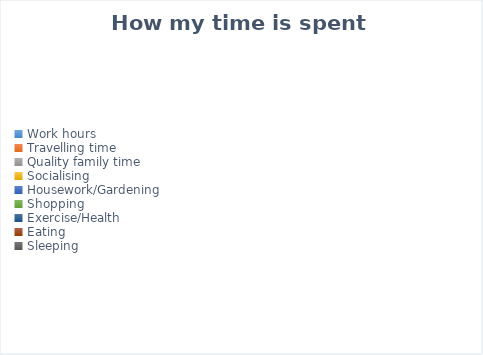
| Category | Series 0 |
|---|---|
| Work hours | 0 |
| Travelling time | 0 |
| Quality family time | 0 |
| Socialising | 0 |
| Housework/Gardening | 0 |
| Shopping | 0 |
| Exercise/Health | 0 |
| Eating | 0 |
| Sleeping | 0 |